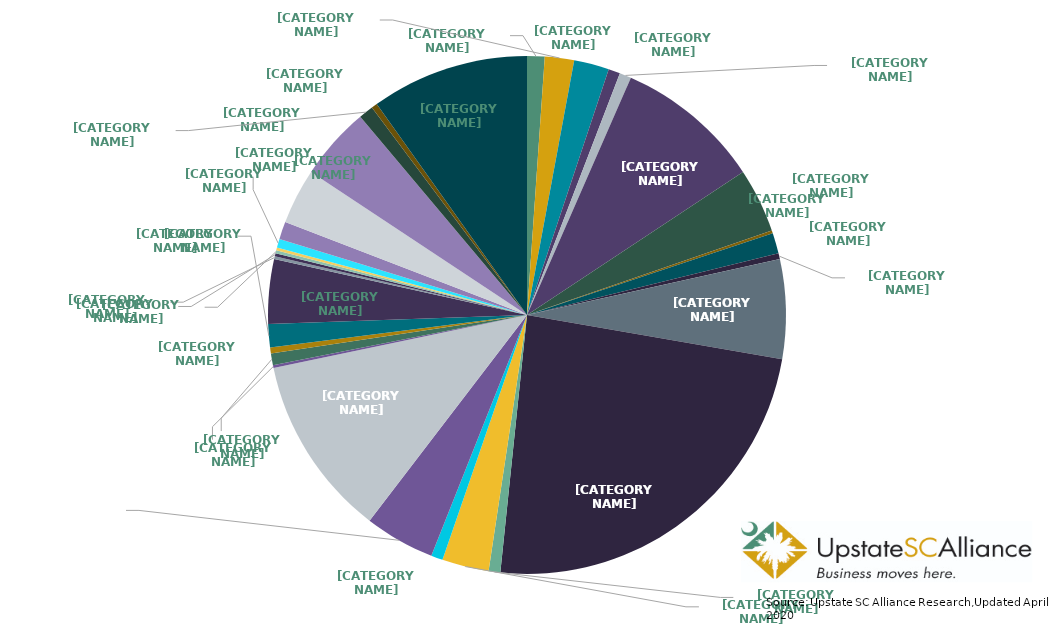
| Category | Percentage |
|---|---|
| Australia | 0.011 |
| Austria | 0.018 |
| Belgium | 0.022 |
| Bermuda | 0.007 |
| Brazil | 0.007 |
| Canada | 0.091 |
| China | 0.04 |
| Czechia | 0.002 |
| Denmark | 0.013 |
| Finland | 0.004 |
| France | 0.062 |
| Germany | 0.239 |
| India | 0.007 |
| Ireland | 0.029 |
| Israel | 0.007 |
| Italy | 0.044 |
| Japan | 0.113 |
| Lithuania | 0.002 |
| Luxembourg | 0.007 |
| Mauritius | 0.004 |
| Mexico | 0.015 |
| Netherlands | 0.04 |
| Poland | 0.002 |
| Portugal | 0.002 |
| Singapore | 0.002 |
| South Africa | 0.002 |
| South Korea | 0.005 |
| Spain | 0.011 |
| Sweden | 0.035 |
| Switzerland | 0.046 |
| Taiwan | 0.009 |
| United Arab Emirates | 0.004 |
| United Kingdom | 0.099 |